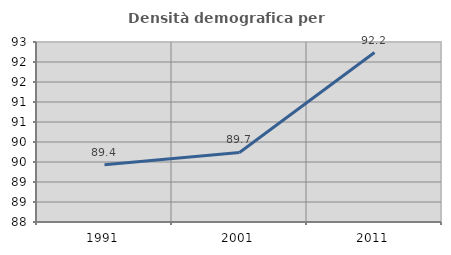
| Category | Densità demografica |
|---|---|
| 1991.0 | 89.43 |
| 2001.0 | 89.738 |
| 2011.0 | 92.237 |